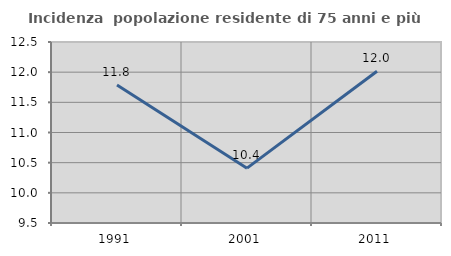
| Category | Incidenza  popolazione residente di 75 anni e più |
|---|---|
| 1991.0 | 11.789 |
| 2001.0 | 10.409 |
| 2011.0 | 12.016 |